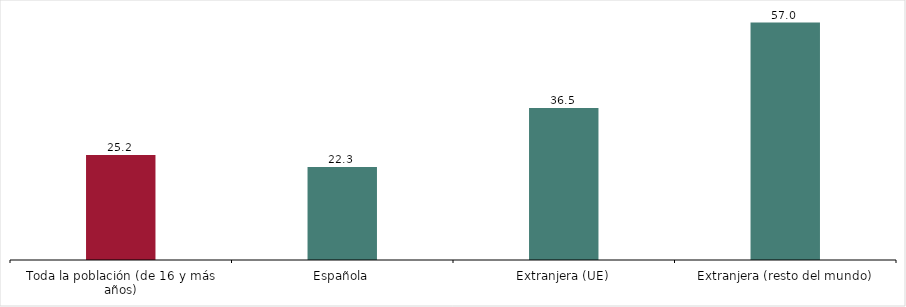
| Category | Por nacionalidad |
|---|---|
| Toda la población (de 16 y más años) | 25.2 |
| Española | 22.3 |
| Extranjera (UE) | 36.5 |
| Extranjera (resto del mundo) | 57 |